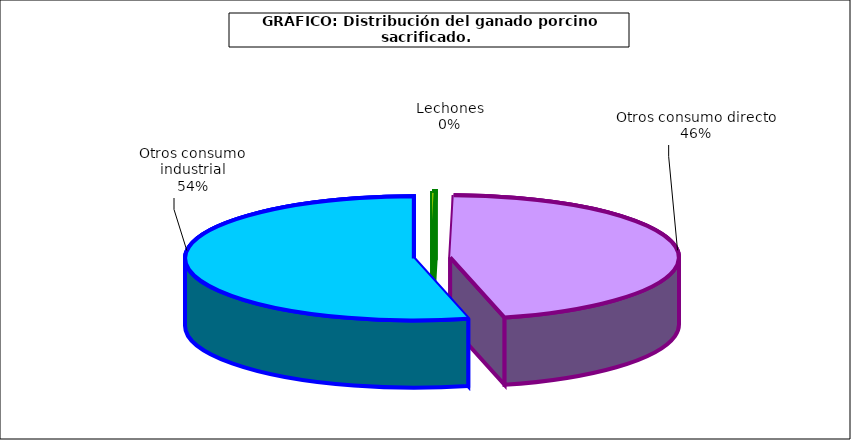
| Category | Series 0 |
|---|---|
| 0 | 11503.03 |
| 1 | 2131701.006 |
| 2 | 2497960.297 |